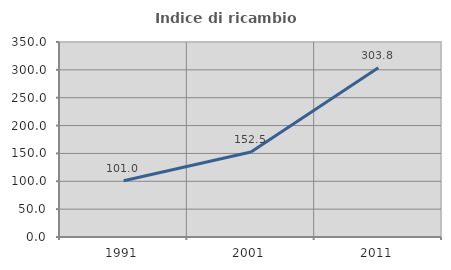
| Category | Indice di ricambio occupazionale  |
|---|---|
| 1991.0 | 100.978 |
| 2001.0 | 152.542 |
| 2011.0 | 303.807 |